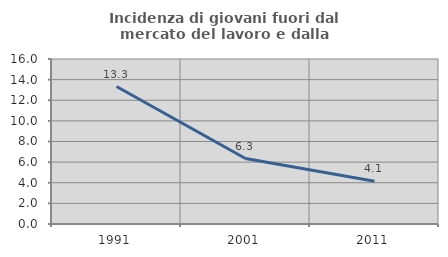
| Category | Incidenza di giovani fuori dal mercato del lavoro e dalla formazione  |
|---|---|
| 1991.0 | 13.333 |
| 2001.0 | 6.349 |
| 2011.0 | 4.145 |